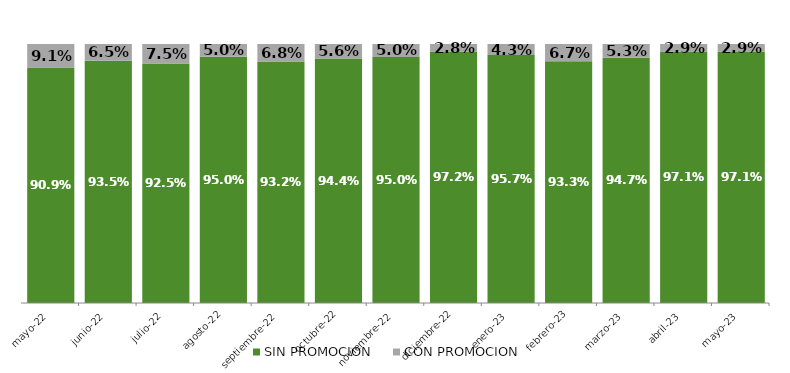
| Category | SIN PROMOCION   | CON PROMOCION   |
|---|---|---|
| 2022-05-01 | 0.909 | 0.091 |
| 2022-06-01 | 0.935 | 0.065 |
| 2022-07-01 | 0.925 | 0.075 |
| 2022-08-01 | 0.95 | 0.05 |
| 2022-09-01 | 0.932 | 0.068 |
| 2022-10-01 | 0.944 | 0.056 |
| 2022-11-01 | 0.95 | 0.05 |
| 2022-12-01 | 0.972 | 0.028 |
| 2023-01-01 | 0.957 | 0.043 |
| 2023-02-01 | 0.933 | 0.067 |
| 2023-03-01 | 0.947 | 0.053 |
| 2023-04-01 | 0.971 | 0.029 |
| 2023-05-01 | 0.971 | 0.029 |